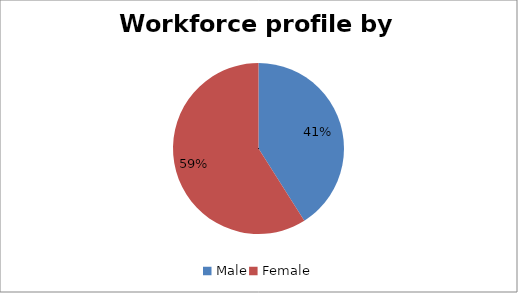
| Category | Series 1 |
|---|---|
| Male | 0.41 |
| Female | 0.59 |